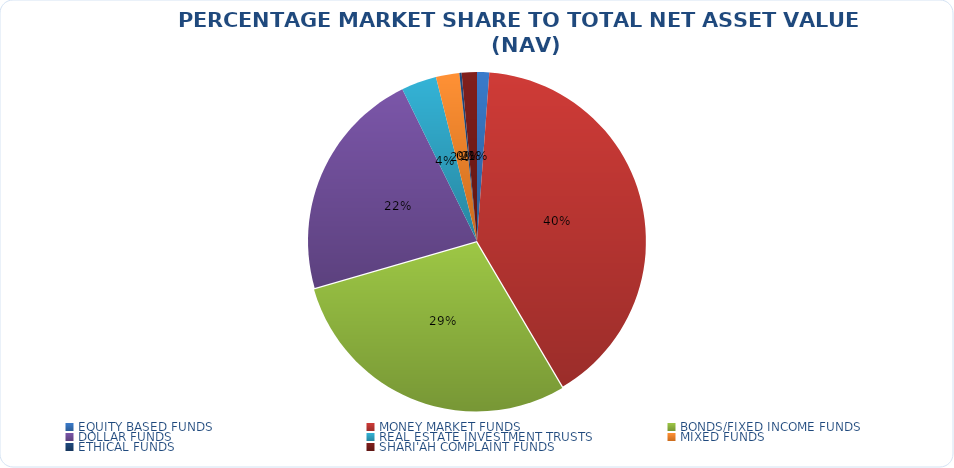
| Category | NET ASSET VALUE |
|---|---|
| EQUITY BASED FUNDS | 15816754624.92 |
| MONEY MARKET FUNDS | 546588410559.366 |
| BONDS/FIXED INCOME FUNDS | 393057479858.38 |
| DOLLAR FUNDS | 300718513630.039 |
| REAL ESTATE INVESTMENT TRUSTS | 45691096677.06 |
| MIXED FUNDS | 30330869358.649 |
| ETHICAL FUNDS | 2917595662.64 |
| SHARI'AH COMPLAINT FUNDS | 19694384377.68 |